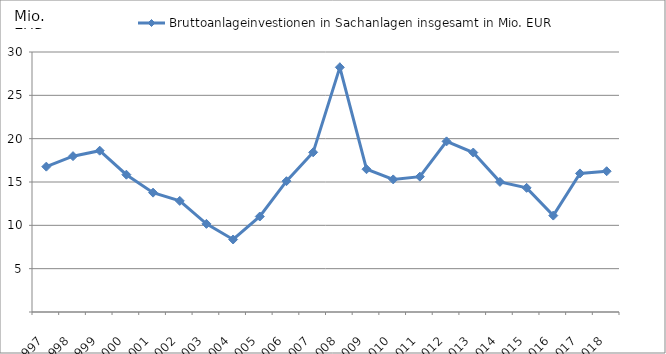
| Category | Bruttoanlageinvestionen in Sachanlagen insgesamt in Mio. EUR |
|---|---|
| 1997.0 | 16.771 |
| 1998.0 | 17.982 |
| 1999.0 | 18.612 |
| 2000.0 | 15.842 |
| 2001.0 | 13.772 |
| 2002.0 | 12.821 |
| 2003.0 | 10.169 |
| 2004.0 | 8.366 |
| 2005.0 | 11.018 |
| 2006.0 | 15.093 |
| 2007.0 | 18.424 |
| 2008.0 | 28.234 |
| 2009.0 | 16.475 |
| 2010.0 | 15.298 |
| 2011.0 | 15.615 |
| 2012.0 | 19.688 |
| 2013.0 | 18.402 |
| 2014.0 | 15.014 |
| 2015.0 | 14.325 |
| 2016.0 | 11.126 |
| 2017.0 | 15.99 |
| 2018.0 | 16.243 |